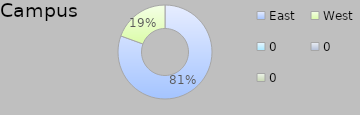
| Category | Campus |
|---|---|
| East | 29 |
| West | 7 |
| 0 | 0 |
| 0 | 0 |
| 0 | 0 |